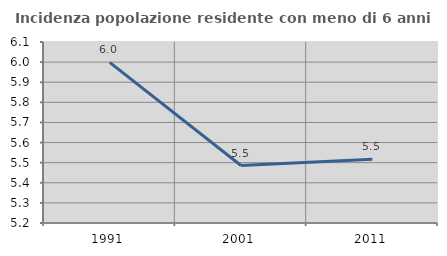
| Category | Incidenza popolazione residente con meno di 6 anni |
|---|---|
| 1991.0 | 5.998 |
| 2001.0 | 5.486 |
| 2011.0 | 5.517 |